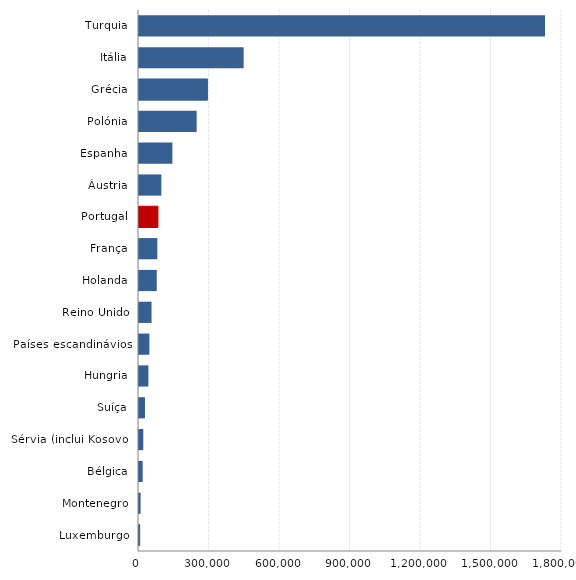
| Category | Series 0 |
|---|---|
| Turquia | 1727720 |
| Itália | 445337 |
| Grécia | 291338 |
| Polónia | 245420 |
| Espanha | 142108 |
| Áustria | 95164 |
| Portugal | 80528 |
| França | 78089 |
| Holanda | 75629 |
| Reino Unido | 53323 |
| Países escandinávios | 44145 |
| Hungria | 40064 |
| Suíça | 25392 |
| Sérvia (inclui Kosovo) | 18228 |
| Bélgica | 15673 |
| Montenegro | 6833 |
| Luxemburgo | 3055 |